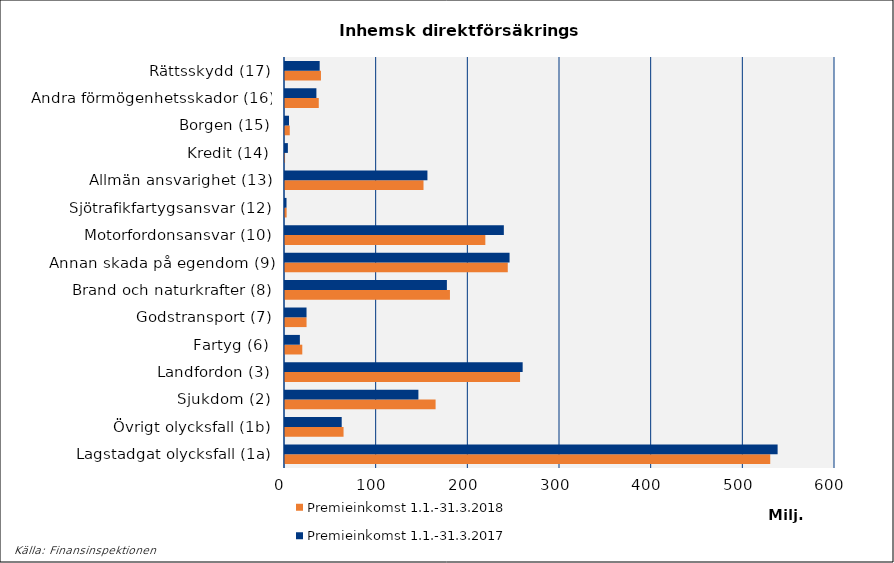
| Category | Premieinkomst |
|---|---|
| Lagstadgat olycksfall (1a) | 537398.608 |
| Övrigt olycksfall (1b) | 61862.08 |
| Sjukdom (2) | 145526.784 |
| Landfordon (3) | 259271.828 |
| Fartyg (6) | 16217.581 |
| Godstransport (7) | 23485.322 |
| Brand och naturkrafter (8) | 176606.004 |
| Annan skada på egendom (9) | 244979.63 |
| Motorfordonsansvar (10) | 238735.31 |
| Sjötrafikfartygsansvar (12) | 1644.077 |
| Allmän ansvarighet (13) | 155376.778 |
| Kredit (14) | 3142.394 |
| Borgen (15) | 4396.295 |
| Andra förmögenhetsskador (16) | 34254.66 |
| Rättsskydd (17) | 37830.226 |